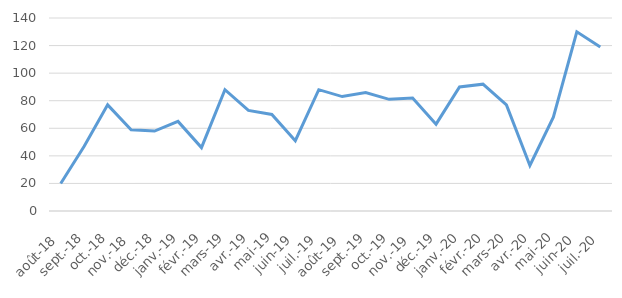
| Category | Series 0 |
|---|---|
| 2018-08-01 | 20 |
| 2018-09-01 | 47 |
| 2018-10-01 | 77 |
| 2018-11-01 | 59 |
| 2018-12-01 | 58 |
| 2019-01-01 | 65 |
| 2019-02-01 | 46 |
| 2019-03-01 | 88 |
| 2019-04-01 | 73 |
| 2019-05-01 | 70 |
| 2019-06-01 | 51 |
| 2019-07-01 | 88 |
| 2019-08-01 | 83 |
| 2019-09-01 | 86 |
| 2019-10-01 | 81 |
| 2019-11-01 | 82 |
| 2019-12-01 | 63 |
| 2020-01-01 | 90 |
| 2020-02-01 | 92 |
| 2020-03-01 | 77 |
| 2020-04-01 | 33 |
| 2020-05-01 | 68 |
| 2020-06-01 | 130 |
| 2020-07-01 | 119 |